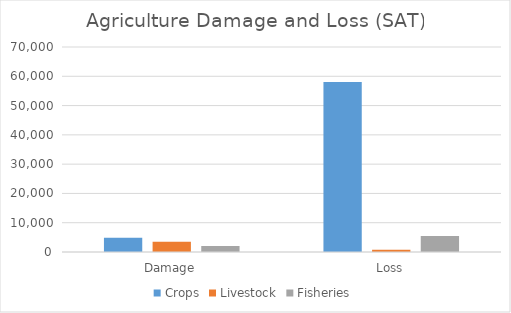
| Category | Crops | Livestock | Fisheries |
|---|---|---|---|
| Damage | 4905 | 3516 | 2084 |
| Loss | 58061 | 800 | 5493 |